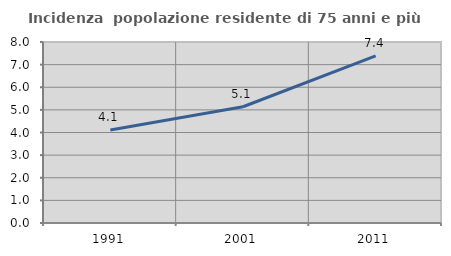
| Category | Incidenza  popolazione residente di 75 anni e più |
|---|---|
| 1991.0 | 4.115 |
| 2001.0 | 5.138 |
| 2011.0 | 7.383 |